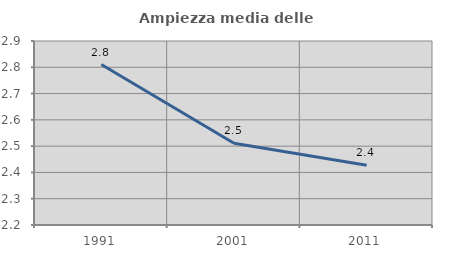
| Category | Ampiezza media delle famiglie |
|---|---|
| 1991.0 | 2.811 |
| 2001.0 | 2.511 |
| 2011.0 | 2.428 |